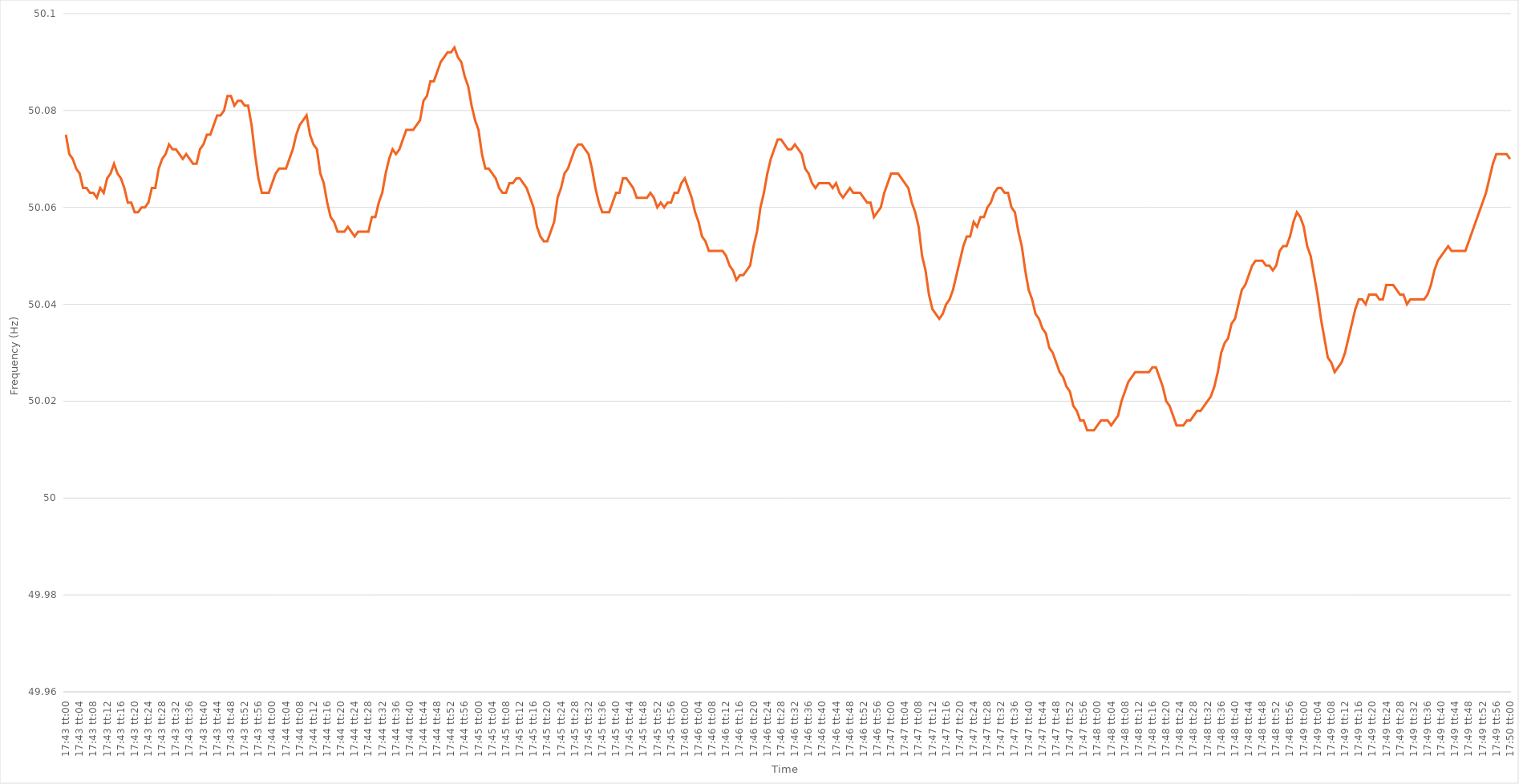
| Category | Series 0 |
|---|---|
| 0.7381944444444444 | 50.075 |
| 0.7382060185185185 | 50.071 |
| 0.7382175925925926 | 50.07 |
| 0.7382291666666667 | 50.068 |
| 0.7382407407407406 | 50.067 |
| 0.7382523148148148 | 50.064 |
| 0.7382638888888889 | 50.064 |
| 0.738275462962963 | 50.063 |
| 0.738287037037037 | 50.063 |
| 0.7382986111111111 | 50.062 |
| 0.7383101851851852 | 50.064 |
| 0.7383217592592594 | 50.063 |
| 0.7383333333333333 | 50.066 |
| 0.7383449074074074 | 50.067 |
| 0.7383564814814815 | 50.069 |
| 0.7383680555555556 | 50.067 |
| 0.7383796296296296 | 50.066 |
| 0.7383912037037037 | 50.064 |
| 0.7384027777777779 | 50.061 |
| 0.7384143518518519 | 50.061 |
| 0.7384259259259259 | 50.059 |
| 0.7384375 | 50.059 |
| 0.7384490740740741 | 50.06 |
| 0.738460648148148 | 50.06 |
| 0.7384722222222222 | 50.061 |
| 0.7384837962962963 | 50.064 |
| 0.7384953703703704 | 50.064 |
| 0.7385069444444444 | 50.068 |
| 0.7385185185185185 | 50.07 |
| 0.7385300925925926 | 50.071 |
| 0.7385416666666668 | 50.073 |
| 0.7385532407407407 | 50.072 |
| 0.7385648148148148 | 50.072 |
| 0.7385763888888889 | 50.071 |
| 0.738587962962963 | 50.07 |
| 0.738599537037037 | 50.071 |
| 0.7386111111111111 | 50.07 |
| 0.7386226851851853 | 50.069 |
| 0.7386342592592593 | 50.069 |
| 0.7386458333333333 | 50.072 |
| 0.7386574074074074 | 50.073 |
| 0.7386689814814815 | 50.075 |
| 0.7386805555555555 | 50.075 |
| 0.7386921296296296 | 50.077 |
| 0.7387037037037038 | 50.079 |
| 0.7387152777777778 | 50.079 |
| 0.7387268518518518 | 50.08 |
| 0.7387384259259259 | 50.083 |
| 0.73875 | 50.083 |
| 0.7387615740740742 | 50.081 |
| 0.7387731481481481 | 50.082 |
| 0.7387847222222222 | 50.082 |
| 0.7387962962962963 | 50.081 |
| 0.7388078703703704 | 50.081 |
| 0.7388194444444444 | 50.077 |
| 0.7388310185185185 | 50.071 |
| 0.7388425925925927 | 50.066 |
| 0.7388541666666667 | 50.063 |
| 0.7388657407407407 | 50.063 |
| 0.7388773148148148 | 50.063 |
| 0.7388888888888889 | 50.065 |
| 0.7389004629629629 | 50.067 |
| 0.738912037037037 | 50.068 |
| 0.7389236111111112 | 50.068 |
| 0.7389351851851852 | 50.068 |
| 0.7389467592592592 | 50.07 |
| 0.7389583333333333 | 50.072 |
| 0.7389699074074074 | 50.075 |
| 0.7389814814814816 | 50.077 |
| 0.7389930555555555 | 50.078 |
| 0.7390046296296297 | 50.079 |
| 0.7390162037037037 | 50.075 |
| 0.7390277777777778 | 50.073 |
| 0.7390393518518518 | 50.072 |
| 0.7390509259259259 | 50.067 |
| 0.7390625000000001 | 50.065 |
| 0.7390740740740741 | 50.061 |
| 0.7390856481481481 | 50.058 |
| 0.7390972222222222 | 50.057 |
| 0.7391087962962963 | 50.055 |
| 0.7391203703703703 | 50.055 |
| 0.7391319444444444 | 50.055 |
| 0.7391435185185186 | 50.056 |
| 0.7391550925925926 | 50.055 |
| 0.7391666666666666 | 50.054 |
| 0.7391782407407407 | 50.055 |
| 0.7391898148148148 | 50.055 |
| 0.739201388888889 | 50.055 |
| 0.7392129629629629 | 50.055 |
| 0.739224537037037 | 50.058 |
| 0.7392361111111111 | 50.058 |
| 0.7392476851851852 | 50.061 |
| 0.7392592592592592 | 50.063 |
| 0.7392708333333333 | 50.067 |
| 0.7392824074074075 | 50.07 |
| 0.7392939814814815 | 50.072 |
| 0.7393055555555555 | 50.071 |
| 0.7393171296296296 | 50.072 |
| 0.7393287037037037 | 50.074 |
| 0.7393402777777777 | 50.076 |
| 0.7393518518518518 | 50.076 |
| 0.739363425925926 | 50.076 |
| 0.739375 | 50.077 |
| 0.739386574074074 | 50.078 |
| 0.7393981481481481 | 50.082 |
| 0.7394097222222222 | 50.083 |
| 0.7394212962962964 | 50.086 |
| 0.7394328703703703 | 50.086 |
| 0.7394444444444445 | 50.088 |
| 0.7394560185185185 | 50.09 |
| 0.7394675925925926 | 50.091 |
| 0.7394791666666666 | 50.092 |
| 0.7394907407407407 | 50.092 |
| 0.7395023148148149 | 50.093 |
| 0.7395138888888889 | 50.091 |
| 0.739525462962963 | 50.09 |
| 0.739537037037037 | 50.087 |
| 0.7395486111111111 | 50.085 |
| 0.7395601851851853 | 50.081 |
| 0.7395717592592592 | 50.078 |
| 0.7395833333333334 | 50.076 |
| 0.7395949074074074 | 50.071 |
| 0.7396064814814814 | 50.068 |
| 0.7396180555555555 | 50.068 |
| 0.7396296296296296 | 50.067 |
| 0.7396412037037038 | 50.066 |
| 0.7396527777777777 | 50.064 |
| 0.7396643518518519 | 50.063 |
| 0.7396759259259259 | 50.063 |
| 0.7396875 | 50.065 |
| 0.739699074074074 | 50.065 |
| 0.7397106481481481 | 50.066 |
| 0.7397222222222223 | 50.066 |
| 0.7397337962962963 | 50.065 |
| 0.7397453703703704 | 50.064 |
| 0.7397569444444444 | 50.062 |
| 0.7397685185185185 | 50.06 |
| 0.7397800925925927 | 50.056 |
| 0.7397916666666666 | 50.054 |
| 0.7398032407407408 | 50.053 |
| 0.7398148148148148 | 50.053 |
| 0.739826388888889 | 50.055 |
| 0.7398379629629629 | 50.057 |
| 0.739849537037037 | 50.062 |
| 0.7398611111111112 | 50.064 |
| 0.7398726851851851 | 50.067 |
| 0.7398842592592593 | 50.068 |
| 0.7398958333333333 | 50.07 |
| 0.7399074074074075 | 50.072 |
| 0.7399189814814814 | 50.073 |
| 0.7399305555555555 | 50.073 |
| 0.7399421296296297 | 50.072 |
| 0.7399537037037037 | 50.071 |
| 0.7399652777777778 | 50.068 |
| 0.7399768518518518 | 50.064 |
| 0.739988425925926 | 50.061 |
| 0.7400000000000001 | 50.059 |
| 0.740011574074074 | 50.059 |
| 0.7400231481481482 | 50.059 |
| 0.7400347222222222 | 50.061 |
| 0.7400462962962964 | 50.063 |
| 0.7400578703703703 | 50.063 |
| 0.7400694444444444 | 50.066 |
| 0.7400810185185186 | 50.066 |
| 0.7400925925925925 | 50.065 |
| 0.7401041666666667 | 50.064 |
| 0.7401157407407407 | 50.062 |
| 0.7401273148148149 | 50.062 |
| 0.7401388888888888 | 50.062 |
| 0.7401504629629629 | 50.062 |
| 0.7401620370370371 | 50.063 |
| 0.7401736111111111 | 50.062 |
| 0.7401851851851852 | 50.06 |
| 0.7401967592592592 | 50.061 |
| 0.7402083333333334 | 50.06 |
| 0.7402199074074075 | 50.061 |
| 0.7402314814814814 | 50.061 |
| 0.7402430555555556 | 50.063 |
| 0.7402546296296296 | 50.063 |
| 0.7402662037037038 | 50.065 |
| 0.7402777777777777 | 50.066 |
| 0.7402893518518519 | 50.064 |
| 0.740300925925926 | 50.062 |
| 0.7403124999999999 | 50.059 |
| 0.7403240740740741 | 50.057 |
| 0.7403356481481481 | 50.054 |
| 0.7403472222222223 | 50.053 |
| 0.7403587962962962 | 50.051 |
| 0.7403703703703703 | 50.051 |
| 0.7403819444444445 | 50.051 |
| 0.7403935185185185 | 50.051 |
| 0.7404050925925926 | 50.051 |
| 0.7404166666666666 | 50.05 |
| 0.7404282407407408 | 50.048 |
| 0.7404398148148149 | 50.047 |
| 0.7404513888888888 | 50.045 |
| 0.740462962962963 | 50.046 |
| 0.740474537037037 | 50.046 |
| 0.7404861111111112 | 50.047 |
| 0.7404976851851851 | 50.048 |
| 0.7405092592592593 | 50.052 |
| 0.7405208333333334 | 50.055 |
| 0.7405324074074073 | 50.06 |
| 0.7405439814814815 | 50.063 |
| 0.7405555555555555 | 50.067 |
| 0.7405671296296297 | 50.07 |
| 0.7405787037037036 | 50.072 |
| 0.7405902777777778 | 50.074 |
| 0.7406018518518519 | 50.074 |
| 0.7406134259259259 | 50.073 |
| 0.740625 | 50.072 |
| 0.740636574074074 | 50.072 |
| 0.7406481481481482 | 50.073 |
| 0.7406597222222223 | 50.072 |
| 0.7406712962962962 | 50.071 |
| 0.7406828703703704 | 50.068 |
| 0.7406944444444444 | 50.067 |
| 0.7407060185185186 | 50.065 |
| 0.7407175925925925 | 50.064 |
| 0.7407291666666667 | 50.065 |
| 0.7407407407407408 | 50.065 |
| 0.7407523148148147 | 50.065 |
| 0.7407638888888889 | 50.065 |
| 0.7407754629629629 | 50.064 |
| 0.7407870370370371 | 50.065 |
| 0.740798611111111 | 50.063 |
| 0.7408101851851852 | 50.062 |
| 0.7408217592592593 | 50.063 |
| 0.7408333333333333 | 50.064 |
| 0.7408449074074074 | 50.063 |
| 0.7408564814814814 | 50.063 |
| 0.7408680555555556 | 50.063 |
| 0.7408796296296297 | 50.062 |
| 0.7408912037037036 | 50.061 |
| 0.7409027777777778 | 50.061 |
| 0.7409143518518518 | 50.058 |
| 0.740925925925926 | 50.059 |
| 0.7409374999999999 | 50.06 |
| 0.7409490740740741 | 50.063 |
| 0.7409606481481482 | 50.065 |
| 0.7409722222222223 | 50.067 |
| 0.7409837962962963 | 50.067 |
| 0.7409953703703703 | 50.067 |
| 0.7410069444444445 | 50.066 |
| 0.7410185185185186 | 50.065 |
| 0.7410300925925926 | 50.064 |
| 0.7410416666666667 | 50.061 |
| 0.7410532407407407 | 50.059 |
| 0.7410648148148148 | 50.056 |
| 0.7410763888888888 | 50.05 |
| 0.741087962962963 | 50.047 |
| 0.7410995370370371 | 50.042 |
| 0.741111111111111 | 50.039 |
| 0.7411226851851852 | 50.038 |
| 0.7411342592592592 | 50.037 |
| 0.7411458333333334 | 50.038 |
| 0.7411574074074073 | 50.04 |
| 0.7411689814814815 | 50.041 |
| 0.7411805555555556 | 50.043 |
| 0.7411921296296297 | 50.046 |
| 0.7412037037037037 | 50.049 |
| 0.7412152777777777 | 50.052 |
| 0.7412268518518519 | 50.054 |
| 0.741238425925926 | 50.054 |
| 0.74125 | 50.057 |
| 0.7412615740740741 | 50.056 |
| 0.7412731481481482 | 50.058 |
| 0.7412847222222222 | 50.058 |
| 0.7412962962962962 | 50.06 |
| 0.7413078703703704 | 50.061 |
| 0.7413194444444445 | 50.063 |
| 0.7413310185185185 | 50.064 |
| 0.7413425925925926 | 50.064 |
| 0.7413541666666666 | 50.063 |
| 0.7413657407407408 | 50.063 |
| 0.7413773148148147 | 50.06 |
| 0.7413888888888889 | 50.059 |
| 0.741400462962963 | 50.055 |
| 0.7414120370370371 | 50.052 |
| 0.7414236111111111 | 50.047 |
| 0.7414351851851851 | 50.043 |
| 0.7414467592592593 | 50.041 |
| 0.7414583333333334 | 50.038 |
| 0.7414699074074074 | 50.037 |
| 0.7414814814814815 | 50.035 |
| 0.7414930555555556 | 50.034 |
| 0.7415046296296296 | 50.031 |
| 0.7415162037037036 | 50.03 |
| 0.7415277777777778 | 50.028 |
| 0.7415393518518519 | 50.026 |
| 0.7415509259259259 | 50.025 |
| 0.7415625 | 50.023 |
| 0.741574074074074 | 50.022 |
| 0.7415856481481482 | 50.019 |
| 0.7415972222222221 | 50.018 |
| 0.7416087962962963 | 50.016 |
| 0.7416203703703704 | 50.016 |
| 0.7416319444444445 | 50.014 |
| 0.7416435185185185 | 50.014 |
| 0.7416550925925925 | 50.014 |
| 0.7416666666666667 | 50.015 |
| 0.7416782407407408 | 50.016 |
| 0.7416898148148148 | 50.016 |
| 0.7417013888888889 | 50.016 |
| 0.741712962962963 | 50.015 |
| 0.741724537037037 | 50.016 |
| 0.741736111111111 | 50.017 |
| 0.7417476851851852 | 50.02 |
| 0.7417592592592593 | 50.022 |
| 0.7417708333333333 | 50.024 |
| 0.7417824074074074 | 50.025 |
| 0.7417939814814815 | 50.026 |
| 0.7418055555555556 | 50.026 |
| 0.7418171296296295 | 50.026 |
| 0.7418287037037037 | 50.026 |
| 0.7418402777777778 | 50.026 |
| 0.7418518518518519 | 50.027 |
| 0.7418634259259259 | 50.027 |
| 0.741875 | 50.025 |
| 0.7418865740740741 | 50.023 |
| 0.7418981481481483 | 50.02 |
| 0.7419097222222222 | 50.019 |
| 0.7419212962962963 | 50.017 |
| 0.7419328703703704 | 50.015 |
| 0.7419444444444444 | 50.015 |
| 0.7419560185185184 | 50.015 |
| 0.7419675925925926 | 50.016 |
| 0.7419791666666667 | 50.016 |
| 0.7419907407407407 | 50.017 |
| 0.7420023148148148 | 50.018 |
| 0.7420138888888889 | 50.018 |
| 0.742025462962963 | 50.019 |
| 0.7420370370370369 | 50.02 |
| 0.7420486111111111 | 50.021 |
| 0.7420601851851852 | 50.023 |
| 0.7420717592592593 | 50.026 |
| 0.7420833333333333 | 50.03 |
| 0.7420949074074074 | 50.032 |
| 0.7421064814814815 | 50.033 |
| 0.7421180555555557 | 50.036 |
| 0.7421296296296296 | 50.037 |
| 0.7421412037037037 | 50.04 |
| 0.7421527777777778 | 50.043 |
| 0.7421643518518519 | 50.044 |
| 0.7421759259259259 | 50.046 |
| 0.7421875 | 50.048 |
| 0.7421990740740741 | 50.049 |
| 0.7422106481481481 | 50.049 |
| 0.7422222222222222 | 50.049 |
| 0.7422337962962963 | 50.048 |
| 0.7422453703703704 | 50.048 |
| 0.7422569444444443 | 50.047 |
| 0.7422685185185185 | 50.048 |
| 0.7422800925925926 | 50.051 |
| 0.7422916666666667 | 50.052 |
| 0.7423032407407407 | 50.052 |
| 0.7423148148148148 | 50.054 |
| 0.7423263888888889 | 50.057 |
| 0.7423379629629631 | 50.059 |
| 0.742349537037037 | 50.058 |
| 0.7423611111111111 | 50.056 |
| 0.7423726851851852 | 50.052 |
| 0.7423842592592593 | 50.05 |
| 0.7423958333333333 | 50.046 |
| 0.7424074074074074 | 50.042 |
| 0.7424189814814816 | 50.037 |
| 0.7424305555555556 | 50.033 |
| 0.7424421296296296 | 50.029 |
| 0.7424537037037037 | 50.028 |
| 0.7424652777777778 | 50.026 |
| 0.7424768518518517 | 50.027 |
| 0.7424884259259259 | 50.028 |
| 0.7425 | 50.03 |
| 0.7425115740740741 | 50.033 |
| 0.7425231481481481 | 50.036 |
| 0.7425347222222222 | 50.039 |
| 0.7425462962962963 | 50.041 |
| 0.7425578703703705 | 50.041 |
| 0.7425694444444444 | 50.04 |
| 0.7425810185185185 | 50.042 |
| 0.7425925925925926 | 50.042 |
| 0.7426041666666667 | 50.042 |
| 0.7426157407407407 | 50.041 |
| 0.7426273148148148 | 50.041 |
| 0.742638888888889 | 50.044 |
| 0.742650462962963 | 50.044 |
| 0.742662037037037 | 50.044 |
| 0.7426736111111111 | 50.043 |
| 0.7426851851851852 | 50.042 |
| 0.7426967592592592 | 50.042 |
| 0.7427083333333333 | 50.04 |
| 0.7427199074074075 | 50.041 |
| 0.7427314814814815 | 50.041 |
| 0.7427430555555555 | 50.041 |
| 0.7427546296296296 | 50.041 |
| 0.7427662037037037 | 50.041 |
| 0.7427777777777779 | 50.042 |
| 0.7427893518518518 | 50.044 |
| 0.742800925925926 | 50.047 |
| 0.7428125 | 50.049 |
| 0.7428240740740741 | 50.05 |
| 0.7428356481481481 | 50.051 |
| 0.7428472222222222 | 50.052 |
| 0.7428587962962964 | 50.051 |
| 0.7428703703703704 | 50.051 |
| 0.7428819444444444 | 50.051 |
| 0.7428935185185185 | 50.051 |
| 0.7429050925925926 | 50.051 |
| 0.7429166666666666 | 50.053 |
| 0.7429282407407407 | 50.055 |
| 0.7429398148148149 | 50.057 |
| 0.7429513888888889 | 50.059 |
| 0.7429629629629629 | 50.061 |
| 0.742974537037037 | 50.063 |
| 0.7429861111111111 | 50.066 |
| 0.7429976851851853 | 50.069 |
| 0.7430092592592592 | 50.071 |
| 0.7430208333333334 | 50.071 |
| 0.7430324074074074 | 50.071 |
| 0.7430439814814815 | 50.071 |
| 0.7430555555555555 | 50.07 |